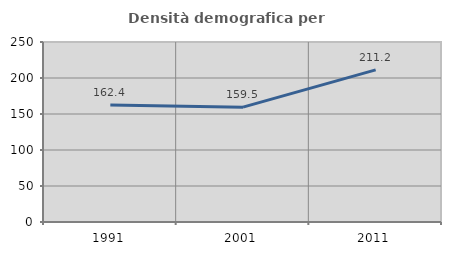
| Category | Densità demografica |
|---|---|
| 1991.0 | 162.404 |
| 2001.0 | 159.474 |
| 2011.0 | 211.23 |